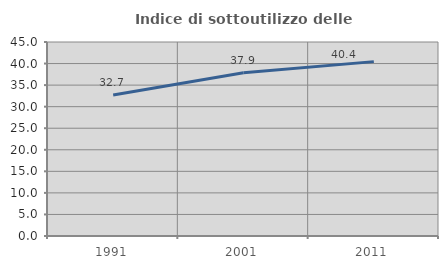
| Category | Indice di sottoutilizzo delle abitazioni  |
|---|---|
| 1991.0 | 32.706 |
| 2001.0 | 37.86 |
| 2011.0 | 40.449 |